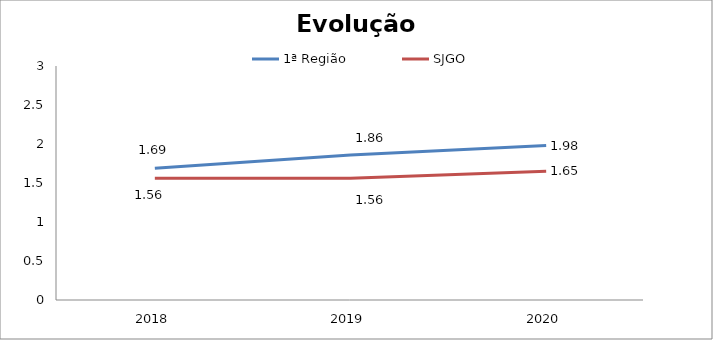
| Category | 1ª Região | SJGO |
|---|---|---|
| 0 | 1.69 | 1.56 |
| 1 | 1.86 | 1.56 |
| 2 | 1.98 | 1.65 |